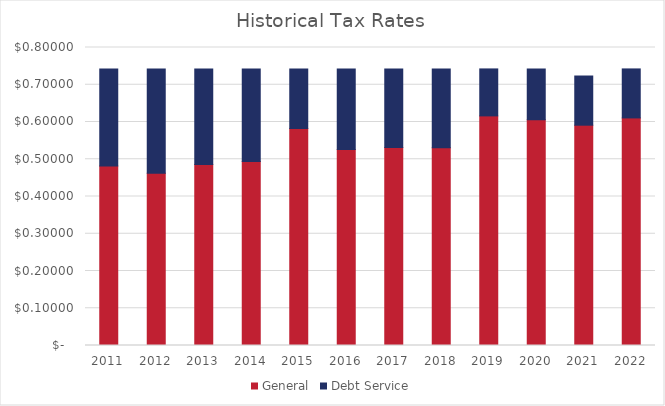
| Category | General | Debt Service |
|---|---|---|
| 2011.0 | 0.482 | 0.261 |
| 2012.0 | 0.463 | 0.28 |
| 2013.0 | 0.486 | 0.257 |
| 2014.0 | 0.494 | 0.248 |
| 2015.0 | 0.583 | 0.16 |
| 2016.0 | 0.526 | 0.216 |
| 2017.0 | 0.531 | 0.211 |
| 2018.0 | 0.531 | 0.212 |
| 2019.0 | 0.616 | 0.126 |
| 2020.0 | 0.606 | 0.136 |
| 2021.0 | 0.591 | 0.132 |
| 2022.0 | 0.611 | 0.132 |